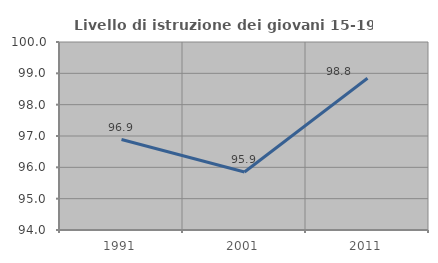
| Category | Livello di istruzione dei giovani 15-19 anni |
|---|---|
| 1991.0 | 96.887 |
| 2001.0 | 95.853 |
| 2011.0 | 98.842 |